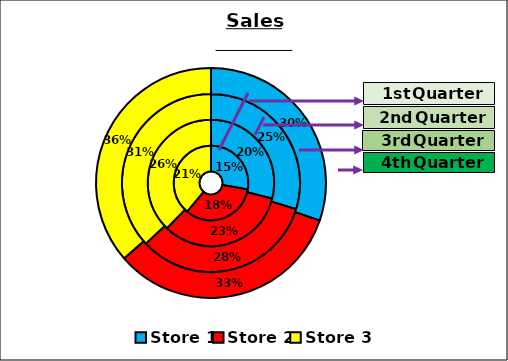
| Category | 1st Quarter | 2nd Quarter | 3rd Quarter | 4th Quarter |
|---|---|---|---|---|
| Store 1 | 0.15 | 0.2 | 0.25 | 0.3 |
| Store 2 | 0.18 | 0.23 | 0.28 | 0.33 |
| Store 3 | 0.21 | 0.26 | 0.31 | 0.36 |